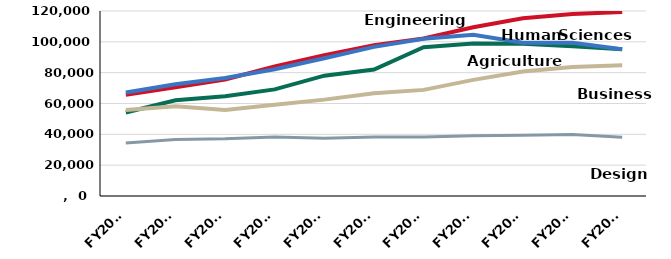
| Category | Agriculture and Life Sciences | Business | Design | Engineering | Human Sciences |
|---|---|---|---|---|---|
| FY2009 | 54126 | 55849 | 34304 | 65639 | 67074 |
| FY2010 | 62143 | 58234 | 36700 | 70483 | 72434 |
| FY2011 | 64722 | 55747 | 37100 | 75584 | 76540 |
| FY2012 | 69169 | 59198 | 38341 | 83983 | 82203 |
| FY2013 | 78068 | 62513 | 37527 | 91384 | 89364 |
| FY2014 | 82008 | 66699 | 38237 | 97881 | 96719 |
| FY2015 | 96557.96 | 68837.4 | 38250.21 | 102114.42 | 102030.75 |
| FY2016 | 98944.95 | 75306.29 | 39154.82 | 109416.59 | 104526.39 |
| FY2017 | 98751.123 | 80738.15 | 39447.34 | 115228.603 | 99360.868 |
| FY2018 | 97091.83 | 83665.5 | 39849.25 | 118103.75 | 99386.97 |
| FY2019 | 95139.662 | 84827.7 | 38176.43 | 119302.995 | 95130.211 |